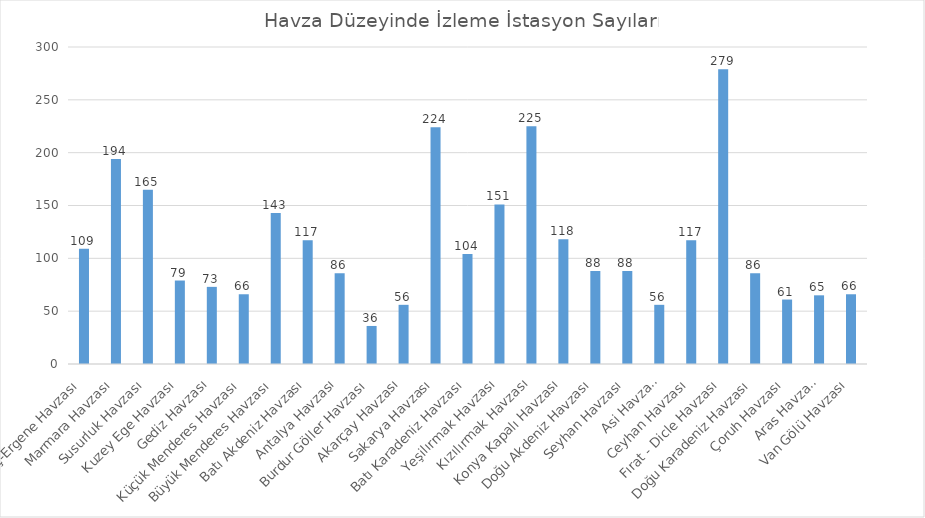
| Category | Series 0 |
|---|---|
| Meriç-Ergene Havzası | 109 |
| Marmara Havzası | 194 |
| Susurluk Havzası | 165 |
| Kuzey Ege Havzası | 79 |
| Gediz Havzası | 73 |
| Küçük Menderes Havzası | 66 |
| Büyük Menderes Havzası | 143 |
| Batı Akdeniz Havzası | 117 |
| Antalya Havzası | 86 |
| Burdur Göller Havzası | 36 |
| Akarçay Havzası | 56 |
| Sakarya Havzası | 224 |
| Batı Karadeniz Havzası | 104 |
| Yeşilırmak Havzası | 151 |
| Kızılırmak Havzası | 225 |
| Konya Kapalı Havzası | 118 |
| Doğu Akdeniz Havzası | 88 |
| Seyhan Havzası | 88 |
| Asi Havzası | 56 |
| Ceyhan Havzası | 117 |
| Fırat - Dicle Havzası | 279 |
| Doğu Karadeniz Havzası | 86 |
| Çoruh Havzası | 61 |
| Aras Havzası | 65 |
| Van Gölü Havzası | 66 |